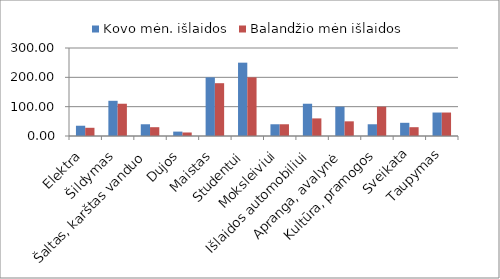
| Category | Kovo mėn. išlaidos | Balandžio mėn išlaidos |
|---|---|---|
| Elektra | 35 | 28 |
| Šildymas | 120 | 110 |
| Šaltas, karštas vanduo | 40 | 30 |
| Dujos | 15 | 12 |
| Maistas | 200 | 180 |
| Studentui | 250 | 200 |
| Moksleiviui | 40 | 40 |
| Išlaidos automobiliui | 110 | 60 |
| Apranga, avalynė | 100 | 50 |
| Kultūra, pramogos | 40 | 100 |
| Sveikata | 45 | 30 |
| Taupymas | 80 | 80 |